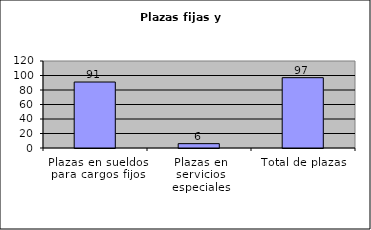
| Category | Series 0 |
|---|---|
| Plazas en sueldos para cargos fijos | 91 |
| Plazas en servicios especiales | 6 |
| Total de plazas | 97 |